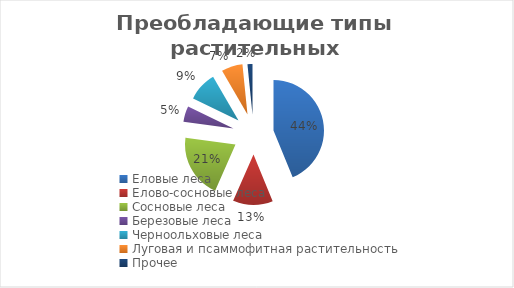
| Category | Series 0 |
|---|---|
| Еловые леса | 43.8 |
| Елово-сосновые леса | 12.8 |
| Сосновые леса | 20.5 |
| Березовые леса | 5.1 |
| Черноольховые леса | 9.4 |
| Луговая и псаммофитная растительность | 6.8 |
| Прочее | 1.6 |